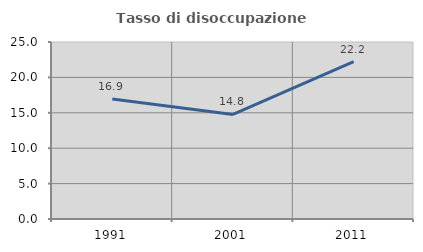
| Category | Tasso di disoccupazione giovanile  |
|---|---|
| 1991.0 | 16.935 |
| 2001.0 | 14.773 |
| 2011.0 | 22.222 |